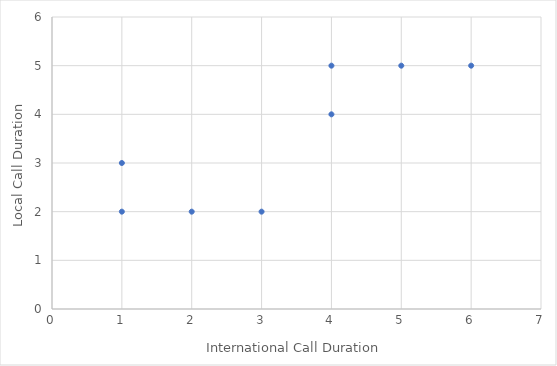
| Category | Y |
|---|---|
| 2.0 | 2 |
| 1.0 | 2 |
| 1.0 | 3 |
| 3.0 | 2 |
| 4.0 | 5 |
| 4.0 | 4 |
| 5.0 | 5 |
| 6.0 | 5 |